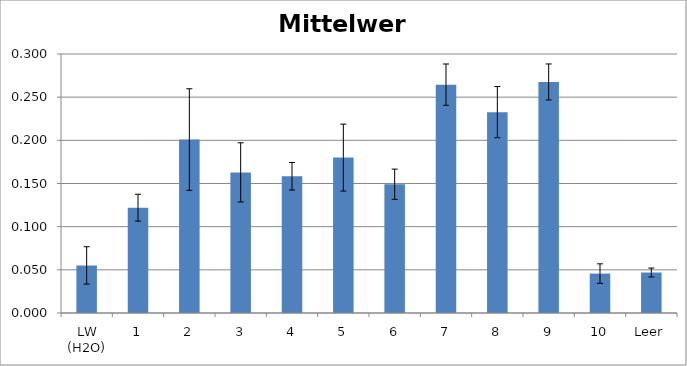
| Category | Mittelwert |
|---|---|
| LW (H2O) | 0.055 |
| 1 | 0.122 |
| 2 | 0.201 |
| 3 | 0.163 |
| 4 | 0.158 |
| 5 | 0.18 |
| 6 | 0.149 |
| 7 | 0.264 |
| 8 | 0.233 |
| 9 | 0.268 |
| 10 | 0.046 |
| Leer | 0.047 |